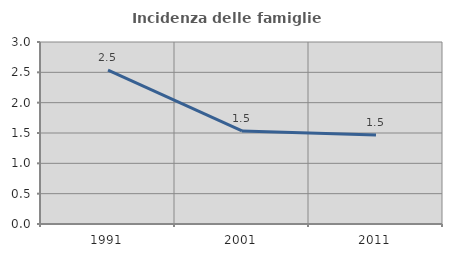
| Category | Incidenza delle famiglie numerose |
|---|---|
| 1991.0 | 2.538 |
| 2001.0 | 1.533 |
| 2011.0 | 1.468 |